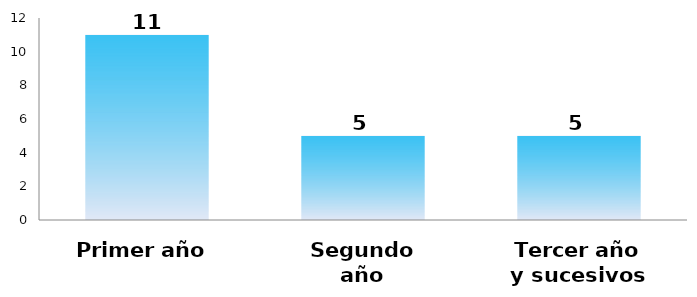
| Category | Series 0 |
|---|---|
| Primer año | 11 |
| Segundo año | 5 |
| Tercer año y sucesivos | 5 |